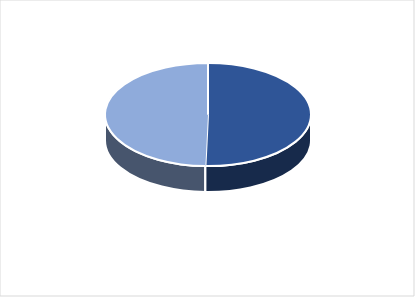
| Category | Series 1 | Series 0 |
|---|---|---|
| PRESUPUESTO VIGENTE PARA 2023 | 25692967 | 25692967 |
| PRESUPUESTO EJECUTADO  | 25284844.78 | 25284844.78 |
| PORCENTAJE DE EJECUCIÓN  | 0.984 | 0.984 |